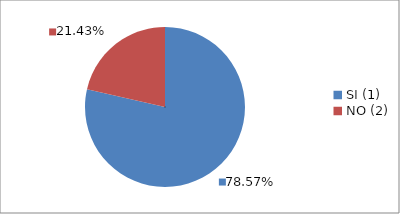
| Category | Series 0 |
|---|---|
| SI (1) | 0.786 |
| NO (2) | 0.214 |